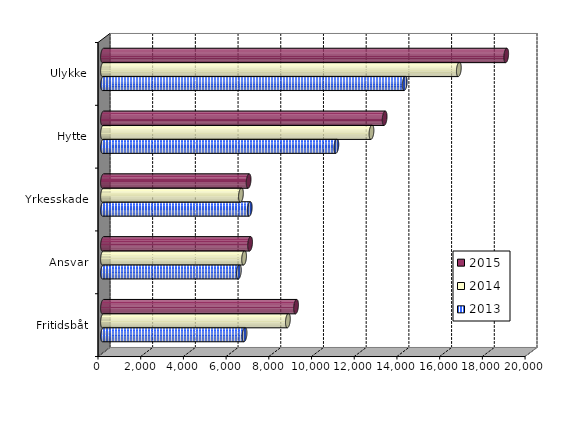
| Category | 2013 | 2014 | 2015 |
|---|---|---|---|
| Fritidsbåt | 6629 | 8659 | 9041.093 |
| Ansvar | 6362.95 | 6607 | 6888.693 |
| Yrkesskade | 6871.8 | 6460 | 6819 |
| Hytte | 10929 | 12573 | 13189.706 |
| Ulykke | 14130.29 | 16664 | 18883.285 |